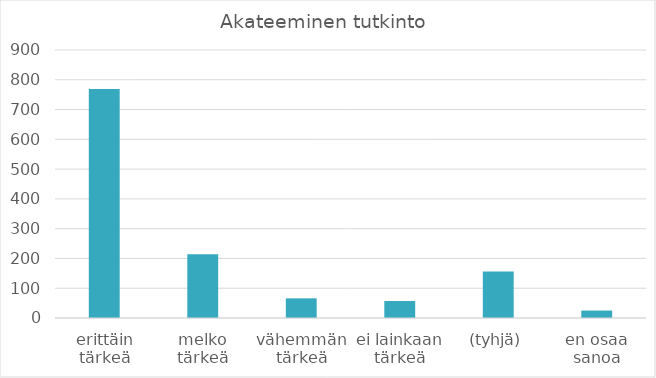
| Category | Summa |
|---|---|
| erittäin tärkeä | 769 |
| melko tärkeä | 214 |
| vähemmän tärkeä | 66 |
| ei lainkaan tärkeä | 57 |
| (tyhjä) | 156 |
| en osaa sanoa | 25 |